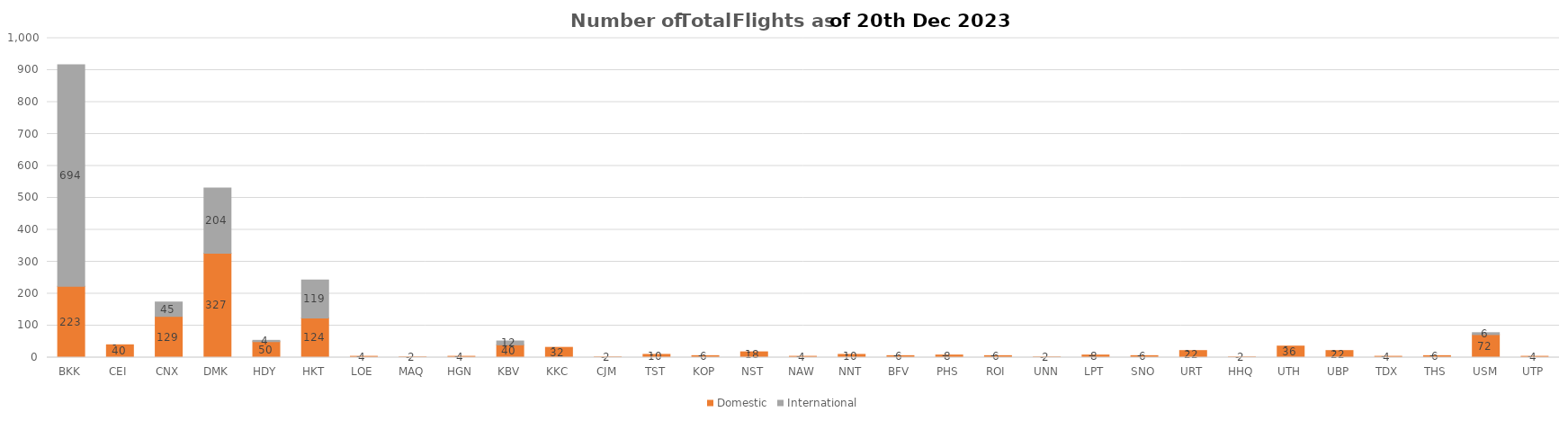
| Category | Domestic | International |
|---|---|---|
| BKK | 223 | 694 |
| CEI | 40 | 0 |
| CNX | 129 | 45 |
| DMK | 327 | 204 |
| HDY | 50 | 4 |
| HKT | 124 | 119 |
| LOE | 4 | 0 |
| MAQ | 2 | 0 |
| HGN | 4 | 0 |
| KBV | 40 | 12 |
| KKC | 32 | 0 |
| CJM | 2 | 0 |
| TST | 10 | 0 |
| KOP | 6 | 0 |
| NST | 18 | 0 |
| NAW | 4 | 0 |
| NNT | 10 | 0 |
| BFV | 6 | 0 |
| PHS | 8 | 0 |
| ROI | 6 | 0 |
| UNN | 2 | 0 |
| LPT | 8 | 0 |
| SNO | 6 | 0 |
| URT | 22 | 0 |
| HHQ | 2 | 0 |
| UTH | 36 | 0 |
| UBP | 22 | 0 |
| TDX | 4 | 0 |
| THS | 6 | 0 |
| USM | 72 | 6 |
| UTP | 4 | 0 |